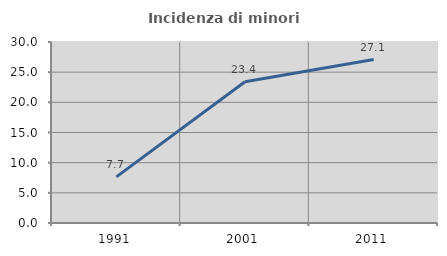
| Category | Incidenza di minori stranieri |
|---|---|
| 1991.0 | 7.65 |
| 2001.0 | 23.417 |
| 2011.0 | 27.095 |